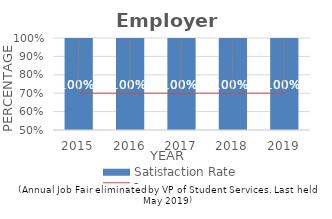
| Category | Satisfaction Rate |
|---|---|
| 2015.0 | 1 |
| 2016.0 | 1 |
| 2017.0 | 1 |
| 2018.0 | 1 |
| 2019.0 | 1 |